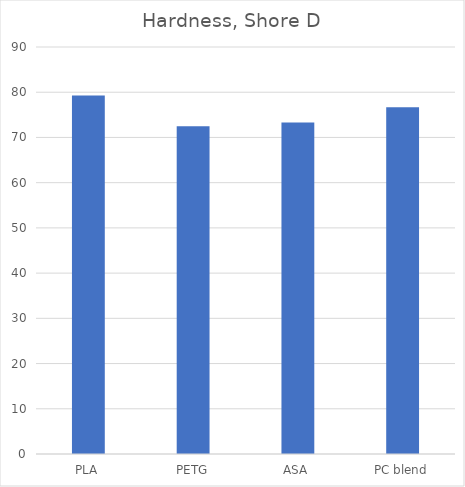
| Category | Shore D |
|---|---|
| PLA | 79.3 |
| PETG | 72.5 |
| ASA | 73.3 |
| PC blend | 76.7 |